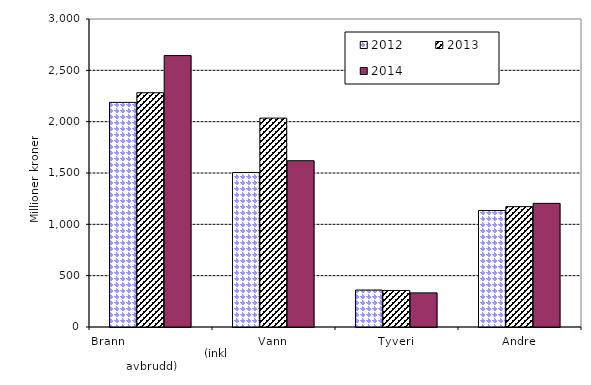
| Category | 2012 | 2013 | 2014 |
|---|---|---|---|
| Brann                                                       (inkl avbrudd) | 2187.766 | 2281.891 | 2643.683 |
| Vann | 1504.409 | 2034.663 | 1619.639 |
| Tyveri | 359.945 | 356.034 | 332.484 |
| Andre | 1134.341 | 1172.209 | 1204.173 |